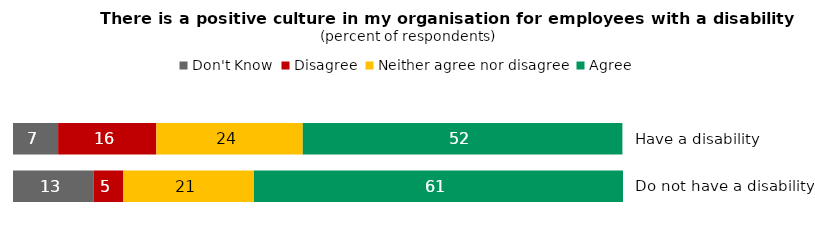
| Category | Don't Know | Disagree | Neither agree nor disagree | Agree |
|---|---|---|---|---|
| Have a disability | 7.4 | 16.1 | 24 | 52.4 |
| Do not have a disability | 13.2 | 4.9 | 21.4 | 60.5 |